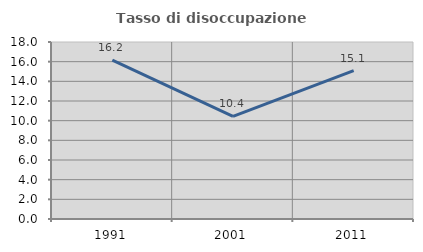
| Category | Tasso di disoccupazione giovanile  |
|---|---|
| 1991.0 | 16.162 |
| 2001.0 | 10.443 |
| 2011.0 | 15.094 |